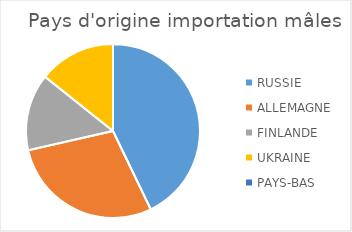
| Category | Series 0 |
|---|---|
| RUSSIE | 3 |
| ALLEMAGNE | 2 |
| FINLANDE | 1 |
| UKRAINE | 1 |
| PAYS-BAS | 0 |